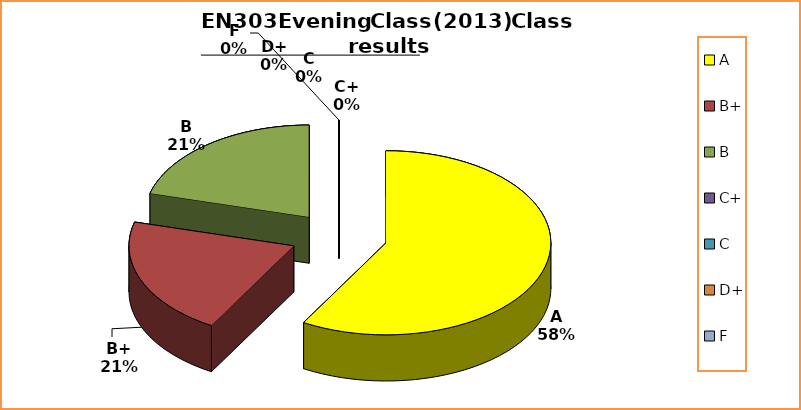
| Category | Series 0 |
|---|---|
| A | 14 |
| B+ | 5 |
| B | 5 |
| C+ | 0 |
| C | 0 |
| D+ | 0 |
| F | 0 |